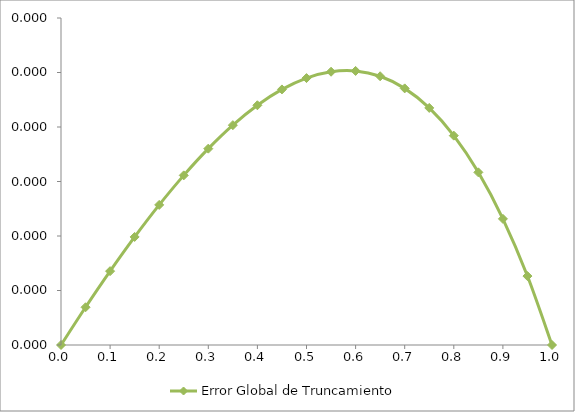
| Category | Error Global de Truncamiento |
|---|---|
| 0.0 | 0 |
| 0.05 | 0 |
| 0.1 | 0 |
| 0.15 | 0 |
| 0.2 | 0 |
| 0.25 | 0 |
| 0.3 | 0 |
| 0.35 | 0 |
| 0.4 | 0 |
| 0.45 | 0 |
| 0.5 | 0 |
| 0.55 | 0 |
| 0.6 | 0 |
| 0.65 | 0 |
| 0.7 | 0 |
| 0.75 | 0 |
| 0.8 | 0 |
| 0.85 | 0 |
| 0.9 | 0 |
| 0.95 | 0 |
| 1.0 | 0 |